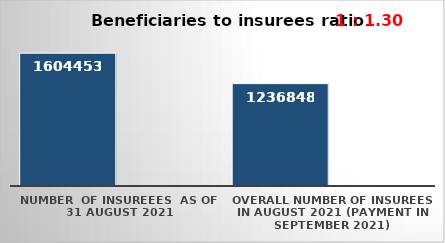
| Category | Series 0 | Series 1 |
|---|---|---|
| NUMBER  of insureees  as of  31 August 2021 | 1604453 |  |
| OVERALL number of insurees in August 2021 (payment in September 2021) | 1236848 |  |